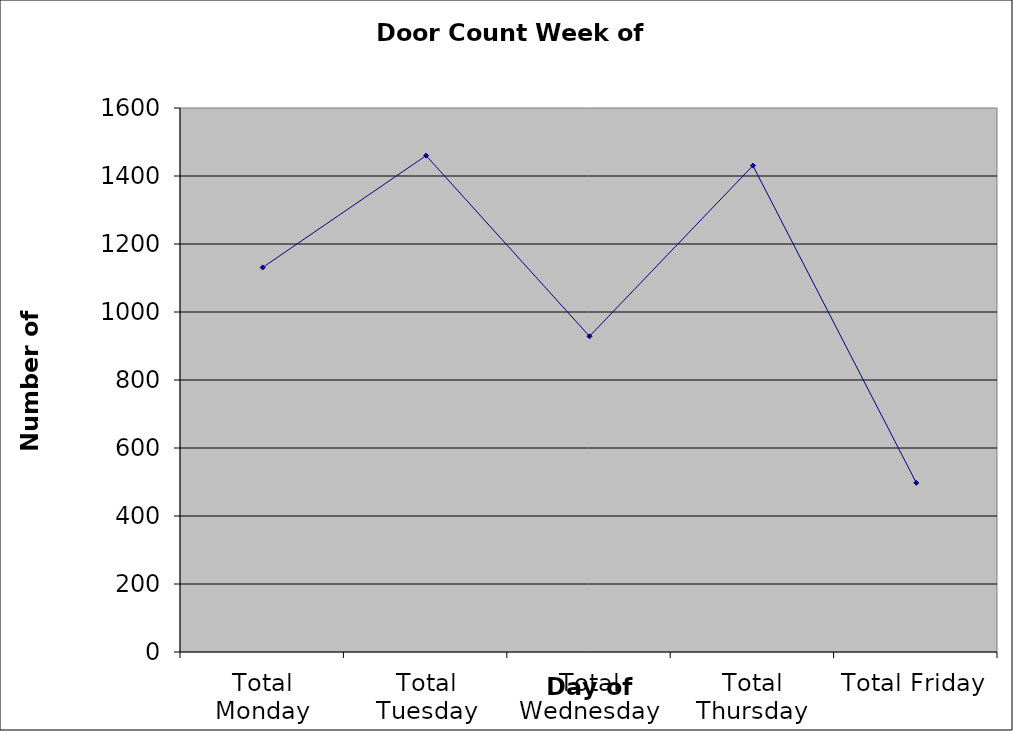
| Category | Series 0 |
|---|---|
| Total Monday | 1131 |
| Total Tuesday | 1460 |
| Total Wednesday | 928.5 |
| Total Thursday | 1430.5 |
| Total Friday | 497.5 |